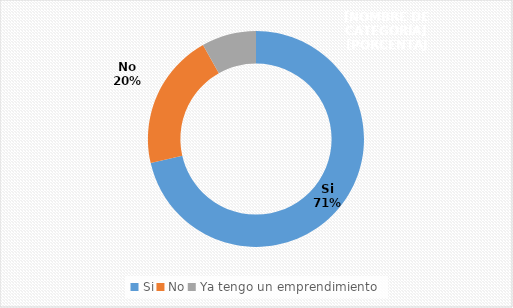
| Category | Series 0 |
|---|---|
| Si | 0.714 |
| No | 0.204 |
| Ya tengo un emprendimiento | 0.082 |